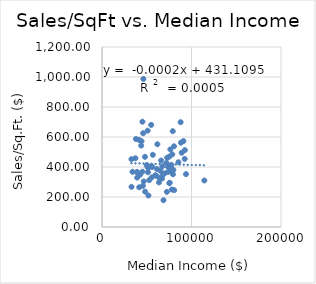
| Category | BachDeg% |
|---|---|
| 31.0 | 45177 |
| 20.0 | 51888 |
| 24.0 | 51379 |
| 29.0 | 66081 |
| 18.0 | 50999 |
| 30.0 | 41562 |
| 14.0 | 44196 |
| 33.0 | 50975 |
| 28.0 | 72808 |
| 29.0 | 79070 |
| 39.0 | 78497 |
| 23.0 | 41245 |
| 22.0 | 33003 |
| 37.0 | 90988 |
| 24.0 | 37950 |
| 17.0 | 45206 |
| 37.0 | 79312 |
| 22.0 | 37345 |
| 36.0 | 46226 |
| 34.0 | 70024 |
| 26.0 | 54982 |
| 20.0 | 54932 |
| 20.0 | 34097 |
| 26.0 | 46593 |
| 21.0 | 51893 |
| 37.0 | 88162 |
| 34.0 | 89016 |
| 34.0 | 114353 |
| 30.0 | 75366 |
| 16.0 | 48163 |
| 28.0 | 49956 |
| 36.0 | 45990 |
| 18.0 | 45723 |
| 36.0 | 43800 |
| 18.0 | 68711 |
| 24.0 | 65150 |
| 22.0 | 39329 |
| 29.0 | 63657 |
| 25.0 | 67099 |
| 28.0 | 75151 |
| 40.0 | 93876 |
| 39.0 | 79701 |
| 30.0 | 77115 |
| 17.0 | 52766 |
| 22.0 | 32929 |
| 29.0 | 87863 |
| 19.0 | 73752 |
| 29.0 | 85366 |
| 18.0 | 39180 |
| 19.0 | 56077 |
| 34.0 | 77449 |
| 25.0 | 56822 |
| 30.0 | 80470 |
| 21.0 | 55584 |
| 30.0 | 78001 |
| 30.0 | 75307 |
| 28.0 | 76375 |
| 31.0 | 61857 |
| 16.0 | 61312 |
| 31.0 | 72040 |
| 40.0 | 92414 |
| 33.0 | 92602 |
| 28.0 | 59599 |
| 23.0 | 72453 |
| 16.0 | 67925 |
| 25.0 | 42631 |
| 25.0 | 75652 |
| 18.0 | 39650 |
| 15.0 | 48033 |
| 19.0 | 67403 |
| 27.0 | 80597 |
| 21.0 | 60928 |
| 29.0 | 73762 |
| 15.0 | 64225 |